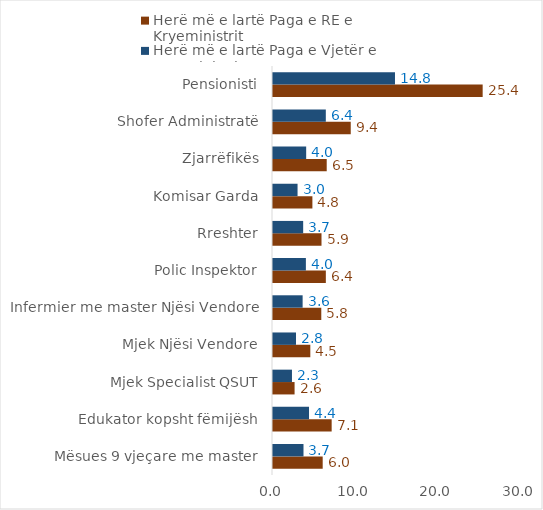
| Category | Herë më e lartë Paga e RE e Kryeministrit | Herë më e lartë Paga e Vjetër e Kryeministrit |
|---|---|---|
| Mësues 9 vjeçare me master | 6.011 | 3.689 |
| Edukator kopsht fëmijësh | 7.096 | 4.357 |
| Mjek Specialist QSUT | 2.61 | 2.294 |
| Mjek Njësi Vendore | 4.513 | 2.78 |
| Infermier me master Njësi Vendore | 5.841 | 3.584 |
| Polic Inspektor | 6.392 | 3.978 |
| Rreshter | 5.868 | 3.65 |
| Komisar Garda | 4.765 | 2.971 |
| Zjarrëfikës | 6.498 | 4.013 |
| Shofer Administratë | 9.405 | 6.389 |
| Pensionisti | 25.363 | 14.757 |